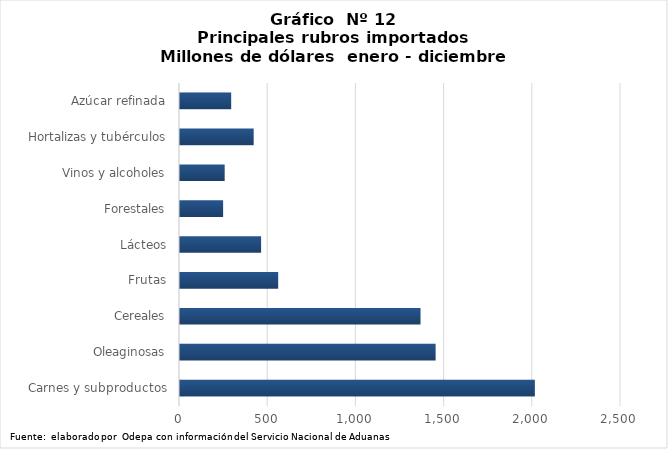
| Category | Series 0 |
|---|---|
| Carnes y subproductos | 2011682.361 |
| Oleaginosas | 1449095.904 |
| Cereales | 1363599.311 |
| Frutas | 556553.375 |
| Lácteos | 459753.539 |
| Forestales | 244456 |
| Vinos y alcoholes | 253306.697 |
| Hortalizas y tubérculos | 417677.542 |
| Azúcar refinada | 290185.818 |